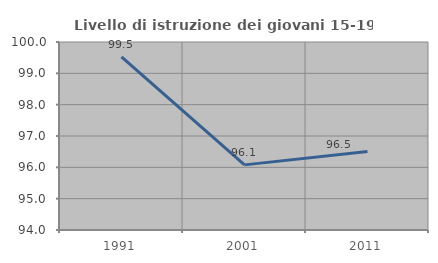
| Category | Livello di istruzione dei giovani 15-19 anni |
|---|---|
| 1991.0 | 99.524 |
| 2001.0 | 96.078 |
| 2011.0 | 96.503 |